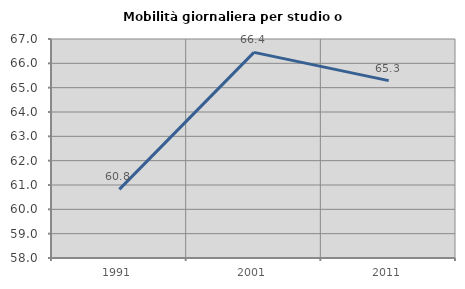
| Category | Mobilità giornaliera per studio o lavoro |
|---|---|
| 1991.0 | 60.822 |
| 2001.0 | 66.45 |
| 2011.0 | 65.289 |